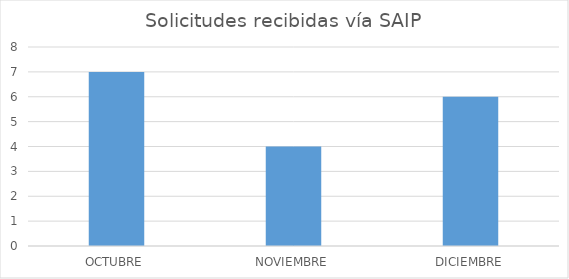
| Category | Series 0 |
|---|---|
| OCTUBRE | 7 |
| NOVIEMBRE | 4 |
| DICIEMBRE | 6 |